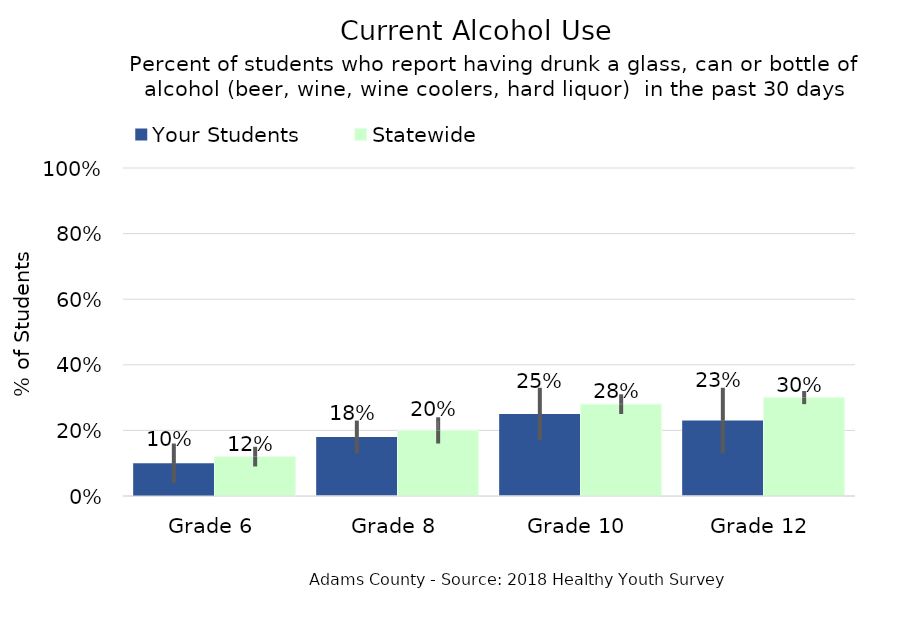
| Category | Your Students | Statewide |
|---|---|---|
| Grade 6 | 0.1 | 0.12 |
| Grade 8 | 0.18 | 0.2 |
| Grade 10 | 0.25 | 0.28 |
| Grade 12 | 0.23 | 0.3 |